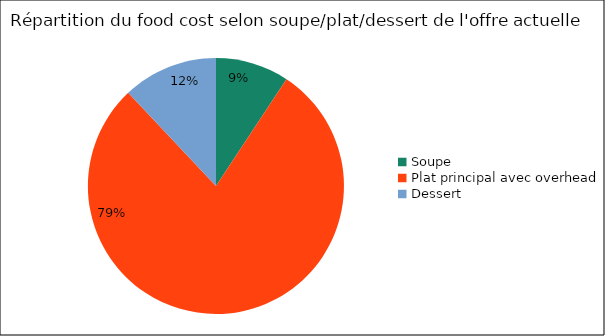
| Category | Series 0 |
|---|---|
| Soupe | 0.093 |
| Plat principal avec overhead | 0.787 |
| Dessert | 0.12 |